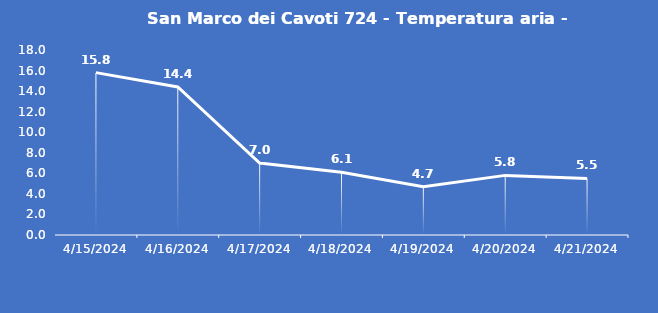
| Category | San Marco dei Cavoti 724 - Temperatura aria - Grezzo (°C) |
|---|---|
| 4/15/24 | 15.8 |
| 4/16/24 | 14.4 |
| 4/17/24 | 7 |
| 4/18/24 | 6.1 |
| 4/19/24 | 4.7 |
| 4/20/24 | 5.8 |
| 4/21/24 | 5.5 |